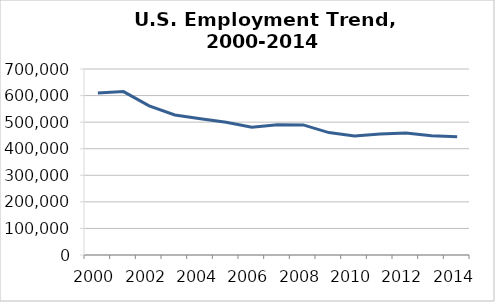
| Category | Series 0 |
|---|---|
| 2000.0 | 609383 |
| 2001.0 | 614946 |
| 2002.0 | 561291 |
| 2003.0 | 527022 |
| 2004.0 | 513180 |
| 2005.0 | 499451 |
| 2006.0 | 481156 |
| 2007.0 | 490368 |
| 2008.0 | 489604 |
| 2009.0 | 460679 |
| 2010.0 | 448145 |
| 2011.0 | 455112 |
| 2012.0 | 458782 |
| 2013.0 | 448618 |
| 2014.0 | 444564 |